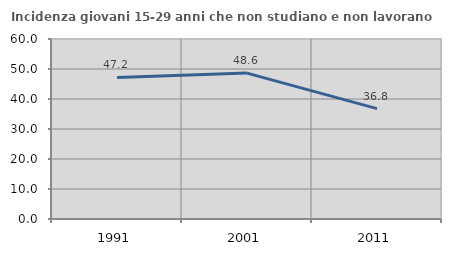
| Category | Incidenza giovani 15-29 anni che non studiano e non lavorano  |
|---|---|
| 1991.0 | 47.194 |
| 2001.0 | 48.637 |
| 2011.0 | 36.803 |